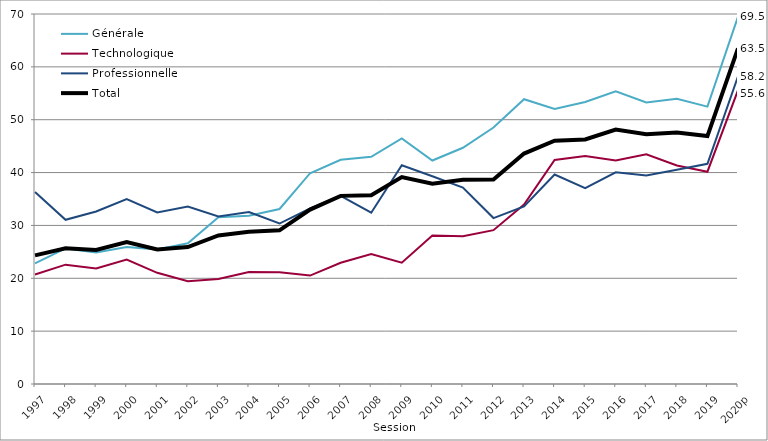
| Category | Générale | Technologique | Professionnelle | Total |
|---|---|---|---|---|
| 1997 | 22.818 | 20.715 | 36.321 | 24.326 |
| 1998 | 25.647 | 22.577 | 31.066 | 25.675 |
| 1999 | 24.878 | 21.873 | 32.634 | 25.361 |
| 2000 | 25.92 | 23.555 | 34.996 | 26.852 |
| 2001 | 25.47 | 21.037 | 32.446 | 25.459 |
| 2002 | 26.609 | 19.447 | 33.557 | 25.9 |
| 2003 | 31.536 | 19.859 | 31.708 | 28.105 |
| 2004 | 31.826 | 21.194 | 32.52 | 28.794 |
| 2005 | 33.105 | 21.134 | 30.36 | 29.074 |
| 2006 | 39.877 | 20.514 | 33.197 | 33.001 |
| 2007 | 42.416 | 22.946 | 35.612 | 35.592 |
| 2008 | 42.99 | 24.581 | 32.404 | 35.694 |
| 2009 | 46.45 | 22.956 | 41.37 | 39.136 |
| 2010 | 42.28 | 28.079 | 39.296 | 37.882 |
| 2011 | 44.695 | 27.957 | 37.172 | 38.641 |
| 2012 | 48.522 | 29.099 | 31.394 | 38.698 |
| 2013 | 53.872 | 33.942 | 33.584 | 43.592 |
| 2014 | 52.016 | 42.387 | 39.622 | 46.037 |
| 2015 | 53.353 | 43.117 | 37.058 | 46.269 |
| 2016 | 55.359 | 42.281 | 40.062 | 48.144 |
| 2017 | 53.247 | 43.473 | 39.47 | 47.256 |
| 2018 | 53.943 | 41.353 | 40.53 | 47.601 |
| 2019 | 52.47 | 40.16 | 41.65 | 46.91 |
| 2020p | 69.5 | 55.6 | 58.2 | 63.5 |